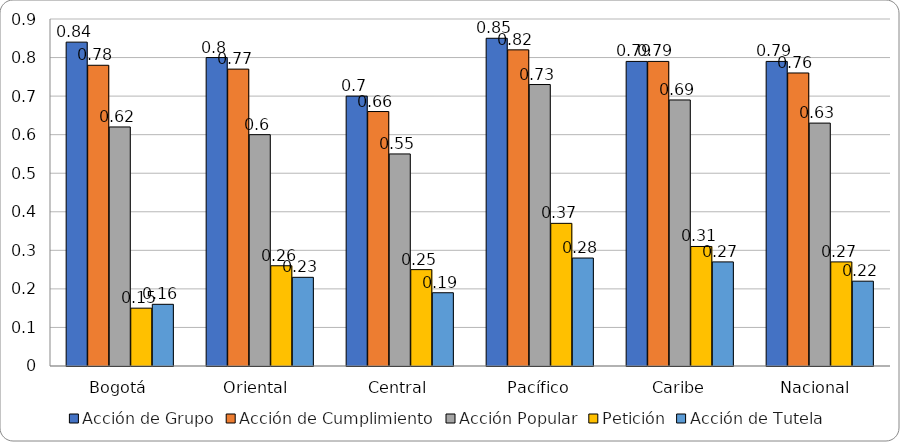
| Category | Acción de Grupo | Acción de Cumplimiento | Acción Popular | Petición | Acción de Tutela |
|---|---|---|---|---|---|
| Bogotá | 0.84 | 0.78 | 0.62 | 0.15 | 0.16 |
| Oriental  | 0.8 | 0.77 | 0.6 | 0.26 | 0.23 |
| Central | 0.7 | 0.66 | 0.55 | 0.25 | 0.19 |
| Pacífico | 0.85 | 0.82 | 0.73 | 0.37 | 0.28 |
| Caribe | 0.79 | 0.79 | 0.69 | 0.31 | 0.27 |
| Nacional  | 0.79 | 0.76 | 0.63 | 0.27 | 0.22 |